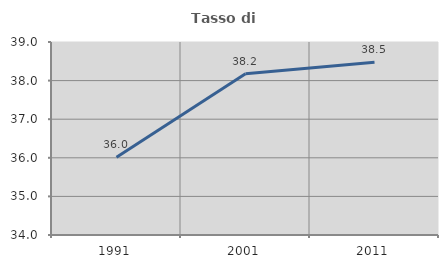
| Category | Tasso di occupazione   |
|---|---|
| 1991.0 | 36.012 |
| 2001.0 | 38.176 |
| 2011.0 | 38.478 |